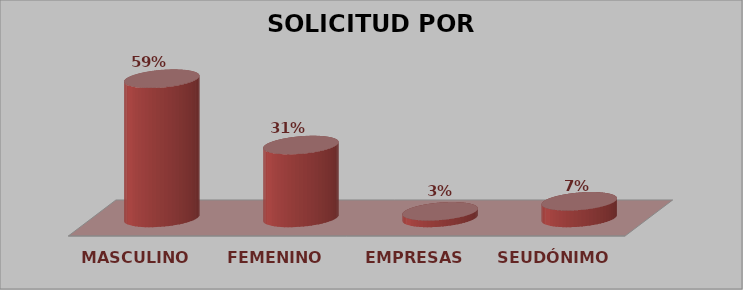
| Category | SOLICITUD POR GÉNERO | Series 1 |
|---|---|---|
| MASCULINO | 292 | 0.591 |
| FEMENINO | 153 | 0.31 |
| EMPRESAS | 14 | 0.028 |
| SEUDÓNIMO | 35 | 0.071 |